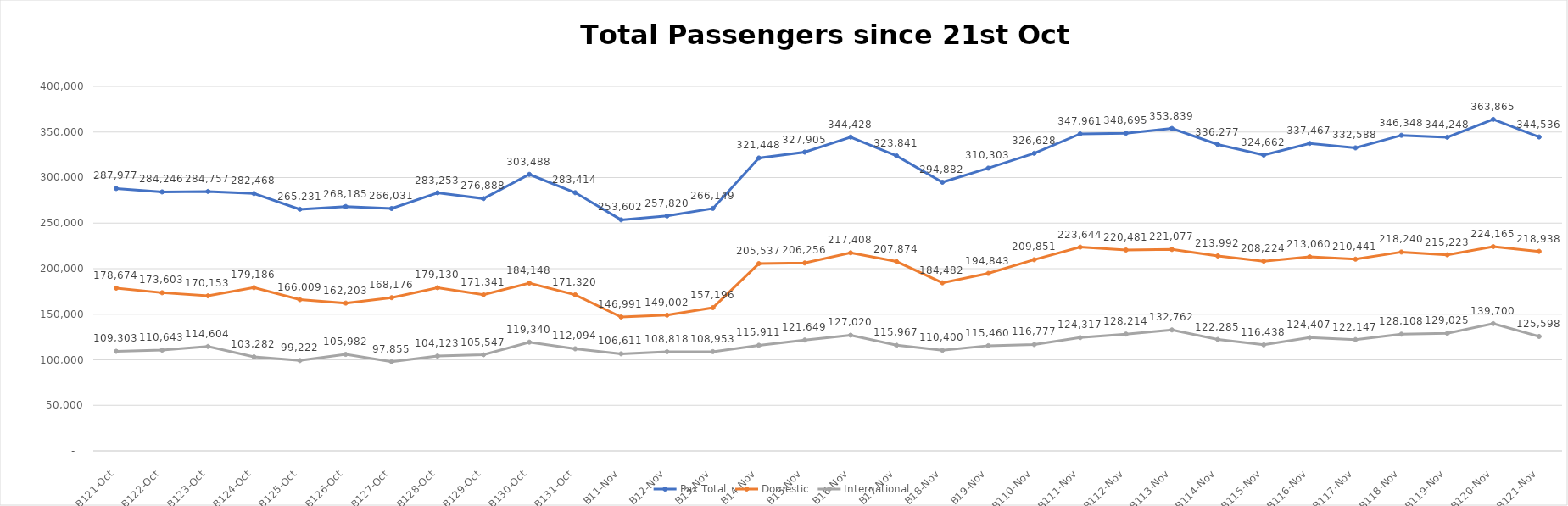
| Category | Pax Total |  Domestic  |  International  |
|---|---|---|---|
| 2022-10-21 | 287977 | 178674 | 109303 |
| 2022-10-22 | 284246 | 173603 | 110643 |
| 2022-10-23 | 284757 | 170153 | 114604 |
| 2022-10-24 | 282468 | 179186 | 103282 |
| 2022-10-25 | 265231 | 166009 | 99222 |
| 2022-10-26 | 268185 | 162203 | 105982 |
| 2022-10-27 | 266031 | 168176 | 97855 |
| 2022-10-28 | 283253 | 179130 | 104123 |
| 2022-10-29 | 276888 | 171341 | 105547 |
| 2022-10-30 | 303488 | 184148 | 119340 |
| 2022-10-31 | 283414 | 171320 | 112094 |
| 2022-11-01 | 253602 | 146991 | 106611 |
| 2022-11-02 | 257820 | 149002 | 108818 |
| 2022-11-03 | 266149 | 157196 | 108953 |
| 2022-11-04 | 321448 | 205537 | 115911 |
| 2022-11-05 | 327905 | 206256 | 121649 |
| 2022-11-06 | 344428 | 217408 | 127020 |
| 2022-11-07 | 323841 | 207874 | 115967 |
| 2022-11-08 | 294882 | 184482 | 110400 |
| 2022-11-09 | 310303 | 194843 | 115460 |
| 2022-11-10 | 326628 | 209851 | 116777 |
| 2022-11-11 | 347961 | 223644 | 124317 |
| 2022-11-12 | 348695 | 220481 | 128214 |
| 2022-11-13 | 353839 | 221077 | 132762 |
| 2022-11-14 | 336277 | 213992 | 122285 |
| 2022-11-15 | 324662 | 208224 | 116438 |
| 2022-11-16 | 337467 | 213060 | 124407 |
| 2022-11-17 | 332588 | 210441 | 122147 |
| 2022-11-18 | 346348 | 218240 | 128108 |
| 2022-11-19 | 344248 | 215223 | 129025 |
| 2022-11-20 | 363865 | 224165 | 139700 |
| 2022-11-21 | 344536 | 218938 | 125598 |